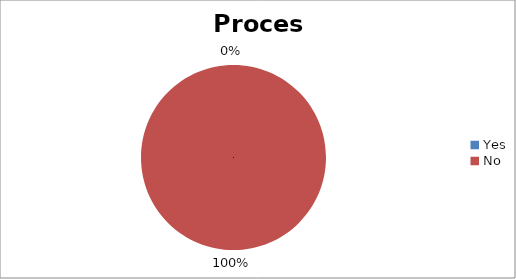
| Category | Process |
|---|---|
| Yes | 0 |
| No | 6 |